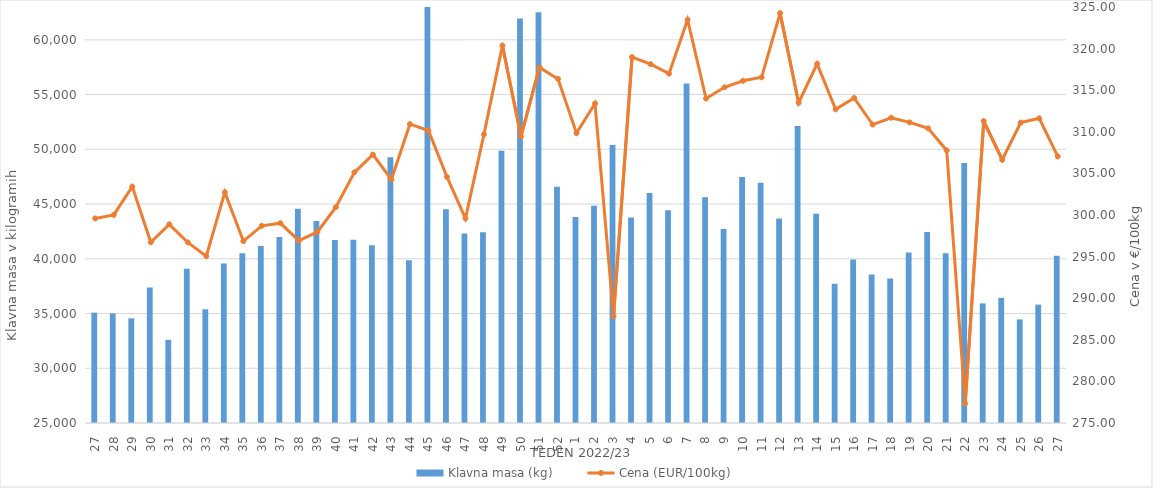
| Category | Klavna masa (kg) |
|---|---|
| 27.0 | 35085 |
| 28.0 | 35007 |
| 29.0 | 34559 |
| 30.0 | 37366 |
| 31.0 | 32599 |
| 32.0 | 39100 |
| 33.0 | 35388 |
| 34.0 | 39563 |
| 35.0 | 40507 |
| 36.0 | 41176 |
| 37.0 | 41983 |
| 38.0 | 44572 |
| 39.0 | 43447 |
| 40.0 | 41711 |
| 41.0 | 41736 |
| 42.0 | 41239 |
| 43.0 | 49284 |
| 44.0 | 39877 |
| 45.0 | 63668 |
| 46.0 | 44528 |
| 47.0 | 42319 |
| 48.0 | 42416 |
| 49.0 | 49873 |
| 50.0 | 61942 |
| 51.0 | 62514 |
| 52.0 | 46589 |
| 1.0 | 43807 |
| 2.0 | 44834 |
| 3.0 | 50386 |
| 4.0 | 43773 |
| 5.0 | 46011 |
| 6.0 | 44439 |
| 7.0 | 56001 |
| 8.0 | 45613 |
| 9.0 | 42730 |
| 10.0 | 47471 |
| 11.0 | 46952 |
| 12.0 | 43683 |
| 13.0 | 52135 |
| 14.0 | 44103 |
| 15.0 | 37719 |
| 16.0 | 39943 |
| 17.0 | 38574 |
| 18.0 | 38200 |
| 19.0 | 40581 |
| 20.0 | 42443 |
| 21.0 | 40517 |
| 22.0 | 48742 |
| 23.0 | 35927 |
| 24.0 | 36436 |
| 25.0 | 34463 |
| 26.0 | 35812 |
| 27.0 | 40280 |